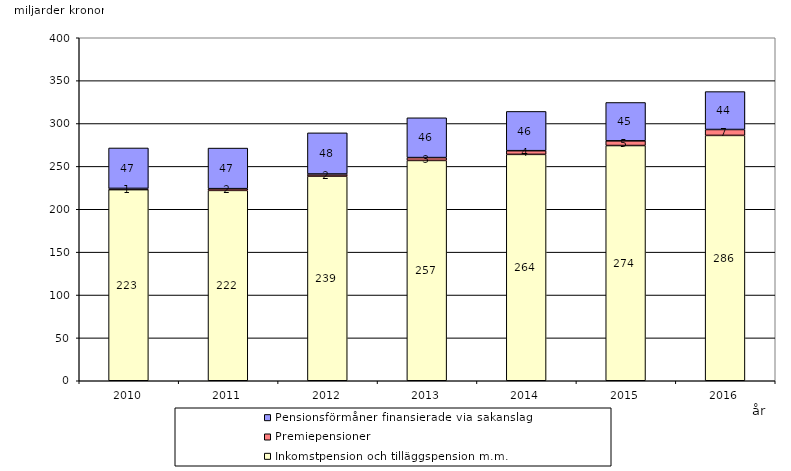
| Category | Inkomstpension och tilläggspension m.m. | Premiepensioner | Pensionsförmåner finansierade via sakanslag |
|---|---|---|---|
| 2010.0 | 222.897 | 1.412 | 47.171 |
| 2011.0 | 222.004 | 2.022 | 47.319 |
| 2012.0 | 238.669 | 2.454 | 47.98 |
| 2013.0 | 256.936 | 3.307 | 46.418 |
| 2014.0 | 264.012 | 4.288 | 45.792 |
| 2015.0 | 274.314 | 5.484 | 44.714 |
| 2016.0 | 286.116 | 6.905 | 44.193 |